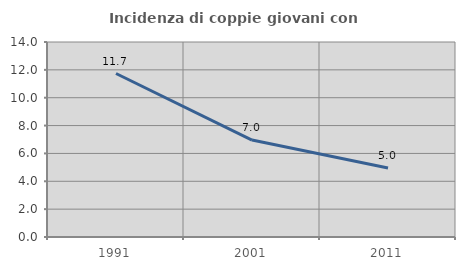
| Category | Incidenza di coppie giovani con figli |
|---|---|
| 1991.0 | 11.738 |
| 2001.0 | 6.962 |
| 2011.0 | 4.959 |